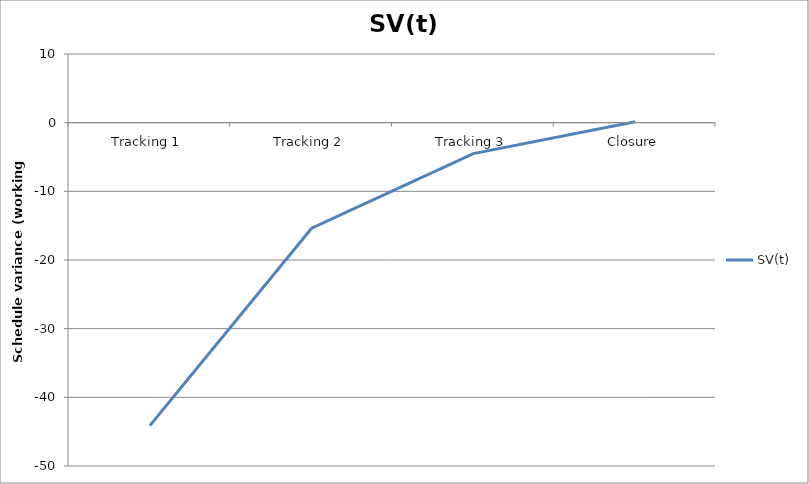
| Category | SV(t) |
|---|---|
| Tracking 1 | -44.125 |
| Tracking 2 | -15.375 |
| Tracking 3 | -4.5 |
| Closure | 0.125 |